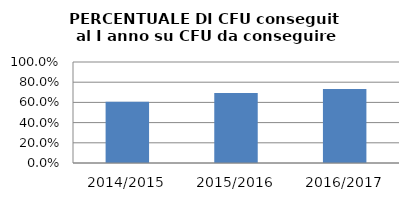
| Category | 2014/2015 2015/2016 2016/2017 |
|---|---|
| 2014/2015 | 0.608 |
| 2015/2016 | 0.693 |
| 2016/2017 | 0.733 |